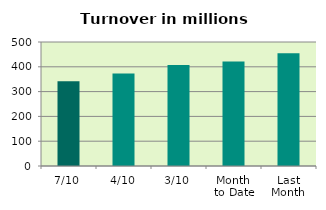
| Category | Series 0 |
|---|---|
| 7/10 | 341.523 |
| 4/10 | 373.381 |
| 3/10 | 407.123 |
| Month 
to Date | 421.183 |
| Last
Month | 454.566 |